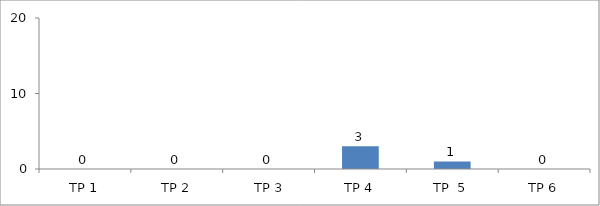
| Category | BIL. MURID |
|---|---|
| TP 1 | 0 |
| TP 2 | 0 |
|  TP 3 | 0 |
| TP 4 | 3 |
| TP  5 | 1 |
| TP 6 | 0 |